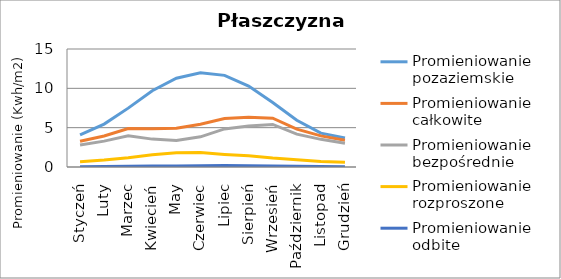
| Category | Promieniowanie pozaziemskie | Promieniowanie całkowite | Promieniowanie bezpośrednie | Promieniowanie rozproszone | Promieniowanie odbite |
|---|---|---|---|---|---|
| Styczeń | 4.099 | 3.269 | 2.802 | 0.669 | 0.047 |
| Luty | 5.457 | 3.937 | 3.287 | 0.885 | 0.066 |
| Marzec | 7.483 | 4.884 | 3.97 | 1.188 | 0.098 |
| Kwiecień | 9.7 | 4.858 | 3.545 | 1.564 | 0.12 |
| May | 11.288 | 4.94 | 3.36 | 1.815 | 0.142 |
| Czerwiec | 11.966 | 5.433 | 3.836 | 1.843 | 0.168 |
| Lipiec | 11.647 | 6.156 | 4.84 | 1.601 | 0.185 |
| Sierpień | 10.284 | 6.32 | 5.22 | 1.419 | 0.163 |
| Wrzesień | 8.19 | 6.202 | 5.408 | 1.137 | 0.129 |
| Październik | 5.94 | 4.817 | 4.178 | 0.925 | 0.082 |
| Listopad | 4.3 | 3.955 | 3.516 | 0.685 | 0.056 |
| Grudzień | 3.675 | 3.41 | 3.031 | 0.594 | 0.045 |